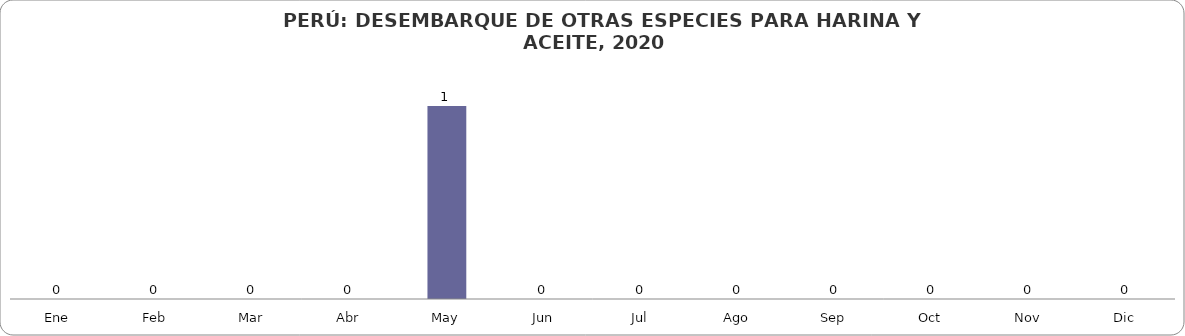
| Category | Total |
|---|---|
| Ene | 0 |
| Feb | 0 |
| Mar | 0 |
| Abr | 0 |
| May | 0.977 |
| Jun | 0 |
| Jul | 0 |
| Ago | 0 |
| Sep | 0 |
| Oct | 0 |
| Nov | 0 |
| Dic | 0 |